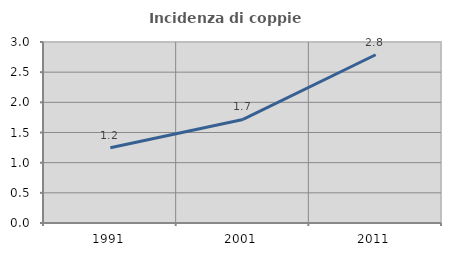
| Category | Incidenza di coppie miste |
|---|---|
| 1991.0 | 1.246 |
| 2001.0 | 1.717 |
| 2011.0 | 2.789 |